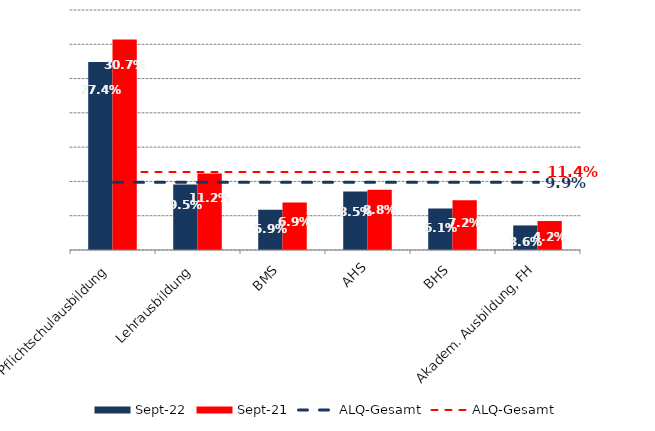
| Category | Sep 22 | Sep 21 |
|---|---|---|
| Pflichtschulausbildung | 0.274 | 0.307 |
| Lehrausbildung | 0.095 | 0.112 |
| BMS | 0.059 | 0.069 |
| AHS | 0.085 | 0.088 |
| BHS | 0.061 | 0.072 |
| Akadem. Ausbildung, FH | 0.036 | 0.042 |